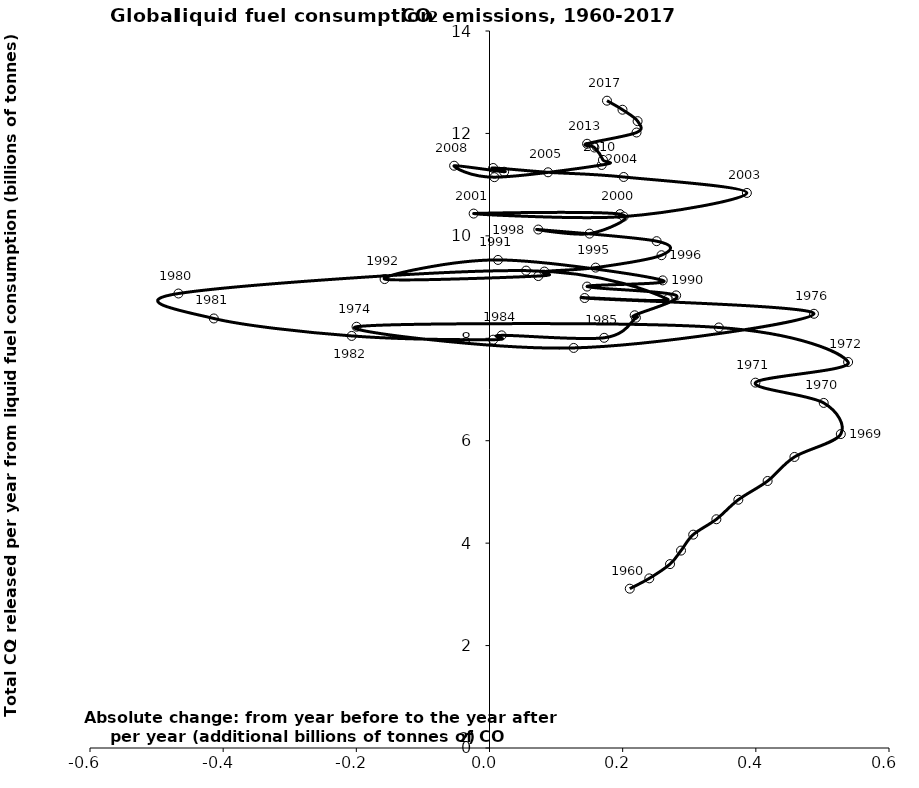
| Category | Series 0 |
|---|---|
| 0.21067999999999998 | 3.111 |
| 0.23999199999999998 | 3.312 |
| 0.27113600000000004 | 3.591 |
| 0.2876240000000001 | 3.855 |
| 0.3059440000000002 | 4.166 |
| 0.3407519999999997 | 4.466 |
| 0.37372799999999984 | 4.847 |
| 0.4176960000000003 | 5.214 |
| 0.4580000000000002 | 5.683 |
| 0.5276160000000001 | 6.13 |
| 0.5019679999999997 | 6.738 |
| 0.39937599999999973 | 7.134 |
| 0.538608 | 7.537 |
| 0.3444160000000003 | 8.211 |
| -0.19968799999999964 | 8.226 |
| 0.12640799999999963 | 7.812 |
| 0.48731199999999975 | 8.478 |
| 0.14289600000000036 | 8.786 |
| 0.2674719999999997 | 8.764 |
| 0.05496000000000034 | 9.321 |
| -0.4671599999999998 | 8.874 |
| -0.41403199999999973 | 8.387 |
| -0.20701599999999942 | 8.046 |
| 0.005495999999999057 | 7.973 |
| 0.018319999999999226 | 8.057 |
| 0.17220800000000036 | 8.01 |
| 0.21984000000000048 | 8.402 |
| 0.2180079999999993 | 8.449 |
| 0.2802959999999999 | 8.838 |
| 0.1465600000000009 | 9.01 |
| 0.2601439999999995 | 9.131 |
| 0.012824000000000169 | 9.53 |
| -0.15755199999999903 | 9.156 |
| 0.07327999999999957 | 9.215 |
| 0.08243999999999918 | 9.303 |
| 0.1593839999999993 | 9.38 |
| 0.2583120000000001 | 9.622 |
| 0.25098400000000076 | 9.896 |
| 0.07328000000000046 | 10.124 |
| 0.15022400000000058 | 10.043 |
| 0.19602399999999953 | 10.424 |
| -0.023816000000000948 | 10.435 |
| 0.20152000000000037 | 10.376 |
| 0.3865520000000009 | 10.838 |
| 0.20152000000000037 | 11.15 |
| 0.08793600000000001 | 11.241 |
| 0.005495999999999945 | 11.325 |
| 0.02198399999999978 | 11.252 |
| -0.05312800000000095 | 11.369 |
| 0.007328000000000223 | 11.146 |
| 0.1685440000000007 | 11.384 |
| 0.17037600000000008 | 11.483 |
| 0.15755199999999991 | 11.725 |
| 0.14655999999999914 | 11.798 |
| 0.22082286195373957 | 12.018 |
| 0.22242855060793332 | 12.24 |
| 0.1997508621674342 | 12.463 |
| 0.17645034702648132 | 12.639 |